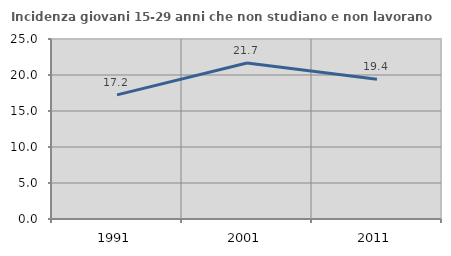
| Category | Incidenza giovani 15-29 anni che non studiano e non lavorano  |
|---|---|
| 1991.0 | 17.241 |
| 2001.0 | 21.656 |
| 2011.0 | 19.403 |